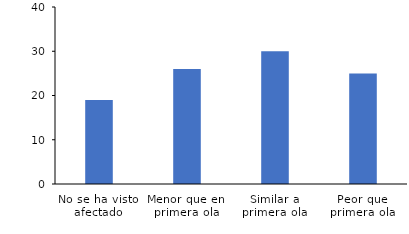
| Category | Series 0 |
|---|---|
| No se ha visto afectado | 19 |
| Menor que en primera ola | 26 |
| Similar a primera ola | 30 |
| Peor que primera ola | 25 |